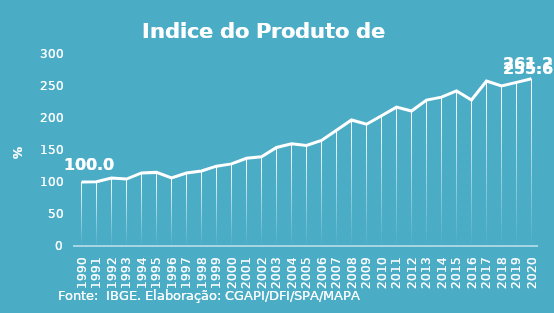
| Category | Indice de Prod. base 1990 |
|---|---|
| 1990.0 | 100 |
| 1991.0 | 100.275 |
| 1992.0 | 106.203 |
| 1993.0 | 104.57 |
| 1994.0 | 114.164 |
| 1995.0 | 115.024 |
| 1996.0 | 106.552 |
| 1997.0 | 114.037 |
| 1998.0 | 117.319 |
| 1999.0 | 124.734 |
| 2000.0 | 128.293 |
| 2001.0 | 136.975 |
| 2002.0 | 139.51 |
| 2003.0 | 153.868 |
| 2004.0 | 159.641 |
| 2005.0 | 157.136 |
| 2006.0 | 164.858 |
| 2007.0 | 180.781 |
| 2008.0 | 196.91 |
| 2009.0 | 190.309 |
| 2010.0 | 203.581 |
| 2011.0 | 217.041 |
| 2012.0 | 210.932 |
| 2013.0 | 228.009 |
| 2014.0 | 232.562 |
| 2015.0 | 242.318 |
| 2016.0 | 228.239 |
| 2017.0 | 257.766 |
| 2018.0 | 250.124 |
| 2019.0 | 255.64 |
| 2020.0 | 261.229 |